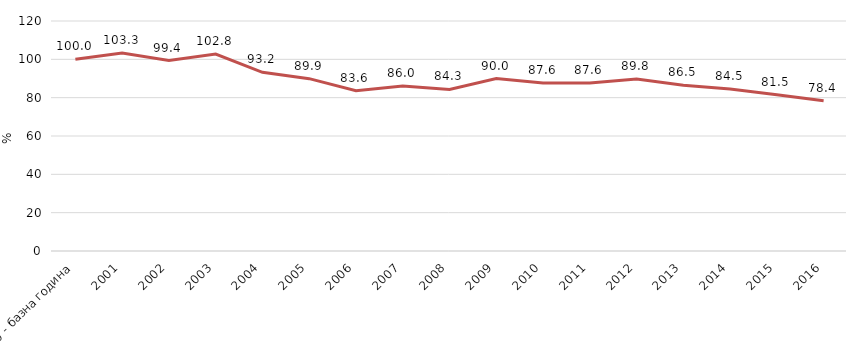
| Category | Индекс 2000=100 |
|---|---|
| 2000 - базна година | 100 |
| 2001 | 103.299 |
| 2002 | 99.385 |
| 2003 | 102.766 |
| 2004 | 93.238 |
| 2005 | 89.92 |
| 2006 | 83.627 |
| 2007 | 86.026 |
| 2008 | 84.325 |
| 2009 | 89.981 |
| 2010 | 87.608 |
| 2011 | 87.621 |
| 2012 | 89.75 |
| 2013 | 86.509 |
| 2014 | 84.481 |
| 2015 | 81.481 |
| 2016 | 78.41 |